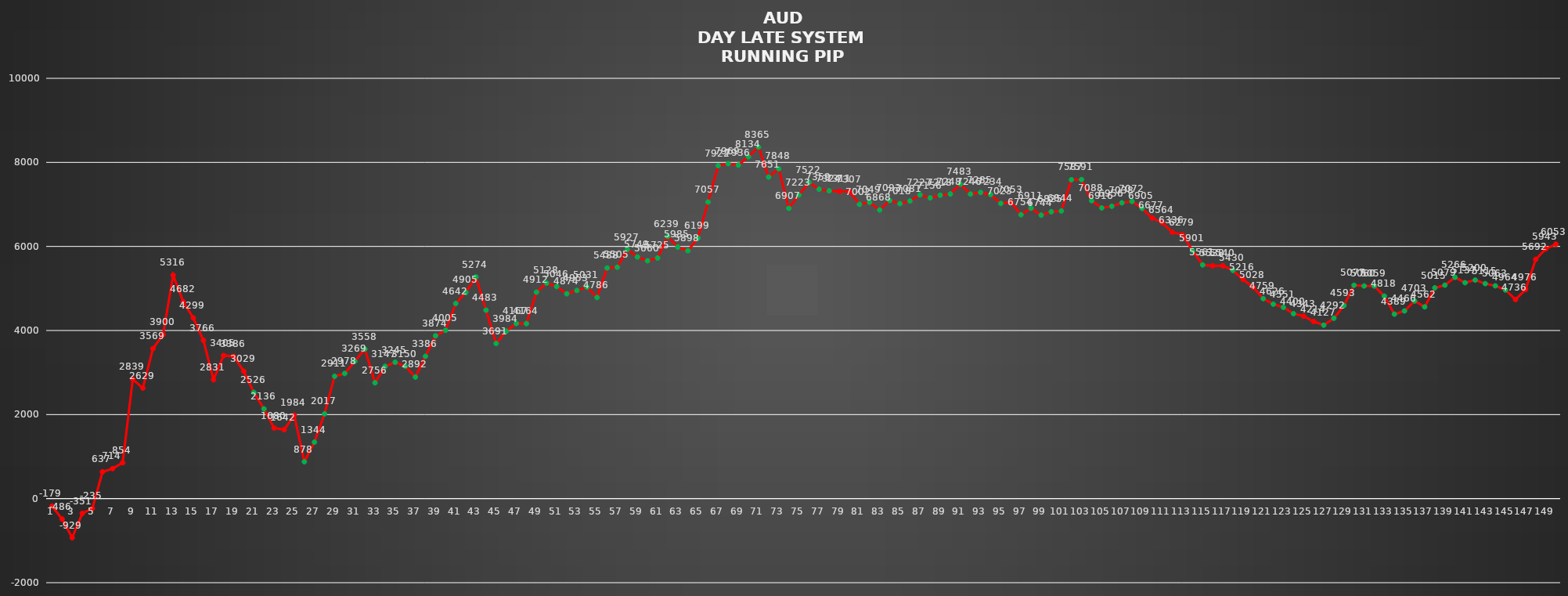
| Category | Series 0 |
|---|---|
| 0 | -179 |
| 1 | -486 |
| 2 | -929 |
| 3 | -351 |
| 4 | -235 |
| 5 | 637 |
| 6 | 714 |
| 7 | 854 |
| 8 | 2839 |
| 9 | 2629 |
| 10 | 3569 |
| 11 | 3900 |
| 12 | 5316 |
| 13 | 4682 |
| 14 | 4299 |
| 15 | 3766 |
| 16 | 2831 |
| 17 | 3405 |
| 18 | 3386 |
| 19 | 3029 |
| 20 | 2526 |
| 21 | 2136 |
| 22 | 1680 |
| 23 | 1642 |
| 24 | 1984 |
| 25 | 878 |
| 26 | 1344 |
| 27 | 2017 |
| 28 | 2911 |
| 29 | 2978 |
| 30 | 3269 |
| 31 | 3558 |
| 32 | 2756 |
| 33 | 3147 |
| 34 | 3245 |
| 35 | 3150 |
| 36 | 2892 |
| 37 | 3386 |
| 38 | 3874 |
| 39 | 4005 |
| 40 | 4642 |
| 41 | 4905 |
| 42 | 5274 |
| 43 | 4483 |
| 44 | 3691 |
| 45 | 3984 |
| 46 | 4167 |
| 47 | 4164 |
| 48 | 4912 |
| 49 | 5128 |
| 50 | 5046 |
| 51 | 4874 |
| 52 | 4953 |
| 53 | 5031 |
| 54 | 4786 |
| 55 | 5488 |
| 56 | 5505 |
| 57 | 5927 |
| 58 | 5749 |
| 59 | 5660 |
| 60 | 5725 |
| 61 | 6239 |
| 62 | 5985 |
| 63 | 5898 |
| 64 | 6199 |
| 65 | 7057 |
| 66 | 7922 |
| 67 | 7969 |
| 68 | 7936 |
| 69 | 8134 |
| 70 | 8365 |
| 71 | 7651 |
| 72 | 7848 |
| 73 | 6907 |
| 74 | 7223 |
| 75 | 7522 |
| 76 | 7359 |
| 77 | 7324 |
| 78 | 7311 |
| 79 | 7307 |
| 80 | 7002 |
| 81 | 7049 |
| 82 | 6868 |
| 83 | 7093 |
| 84 | 7018 |
| 85 | 7081 |
| 86 | 7227 |
| 87 | 7156 |
| 88 | 7218 |
| 89 | 7248 |
| 90 | 7483 |
| 91 | 7246 |
| 92 | 7285 |
| 93 | 7234 |
| 94 | 7023 |
| 95 | 7053 |
| 96 | 6754 |
| 97 | 6911 |
| 98 | 6744 |
| 99 | 6825 |
| 100 | 6844 |
| 101 | 7587 |
| 102 | 7591 |
| 103 | 7088 |
| 104 | 6916 |
| 105 | 6956 |
| 106 | 7038 |
| 107 | 7072 |
| 108 | 6905 |
| 109 | 6677 |
| 110 | 6564 |
| 111 | 6336 |
| 112 | 6279 |
| 113 | 5901 |
| 114 | 5561 |
| 115 | 5538 |
| 116 | 5540 |
| 117 | 5430 |
| 118 | 5216 |
| 119 | 5028 |
| 120 | 4759 |
| 121 | 4626 |
| 122 | 4551 |
| 123 | 4400 |
| 124 | 4343 |
| 125 | 4214 |
| 126 | 4127 |
| 127 | 4292 |
| 128 | 4593 |
| 129 | 5077 |
| 130 | 5060 |
| 131 | 5059 |
| 132 | 4818 |
| 133 | 4389 |
| 134 | 4466 |
| 135 | 4703 |
| 136 | 4562 |
| 137 | 5015 |
| 138 | 5079 |
| 139 | 5266 |
| 140 | 5137 |
| 141 | 5200 |
| 142 | 5115 |
| 143 | 5063 |
| 144 | 4964 |
| 145 | 4736 |
| 146 | 4976 |
| 147 | 5692 |
| 148 | 5943 |
| 149 | 6053 |